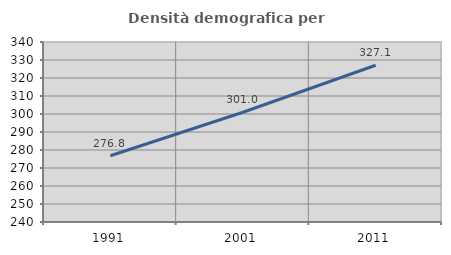
| Category | Densità demografica |
|---|---|
| 1991.0 | 276.804 |
| 2001.0 | 300.988 |
| 2011.0 | 327.091 |